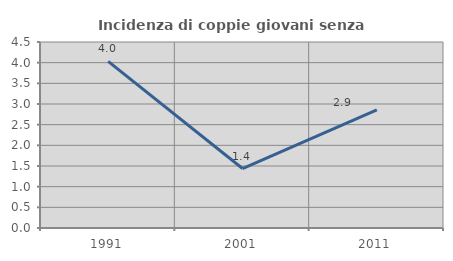
| Category | Incidenza di coppie giovani senza figli |
|---|---|
| 1991.0 | 4.032 |
| 2001.0 | 1.439 |
| 2011.0 | 2.857 |